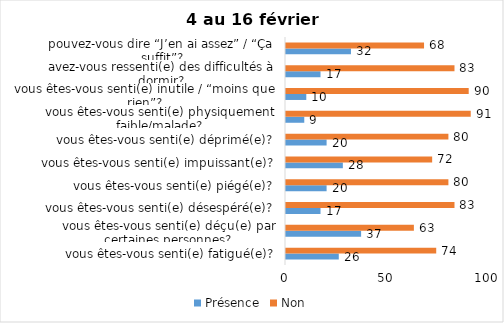
| Category | Présence | Non |
|---|---|---|
| vous êtes-vous senti(e) fatigué(e)? | 26 | 74 |
| vous êtes-vous senti(e) déçu(e) par certaines personnes? | 37 | 63 |
| vous êtes-vous senti(e) désespéré(e)? | 17 | 83 |
| vous êtes-vous senti(e) piégé(e)? | 20 | 80 |
| vous êtes-vous senti(e) impuissant(e)? | 28 | 72 |
| vous êtes-vous senti(e) déprimé(e)? | 20 | 80 |
| vous êtes-vous senti(e) physiquement faible/malade? | 9 | 91 |
| vous êtes-vous senti(e) inutile / “moins que rien”? | 10 | 90 |
| avez-vous ressenti(e) des difficultés à dormir? | 17 | 83 |
| pouvez-vous dire “J’en ai assez” / “Ça suffit”? | 32 | 68 |